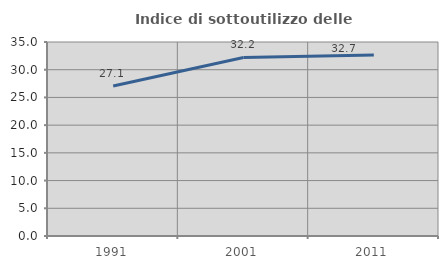
| Category | Indice di sottoutilizzo delle abitazioni  |
|---|---|
| 1991.0 | 27.068 |
| 2001.0 | 32.216 |
| 2011.0 | 32.65 |